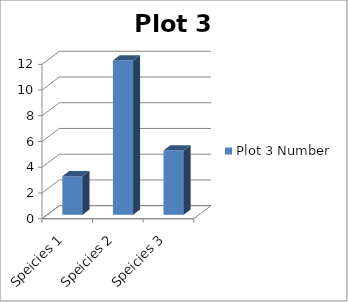
| Category | Plot 3 Number |
|---|---|
| Speicies 1 | 3 |
| Speicies 2 | 12 |
| Speicies 3 | 5 |